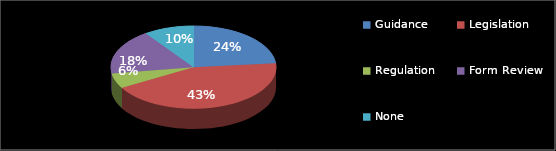
| Category | Series 0 |
|---|---|
| Guidance | 12 |
| Legislation | 22 |
| Regulation | 3 |
| Form Review | 9 |
| None | 5 |